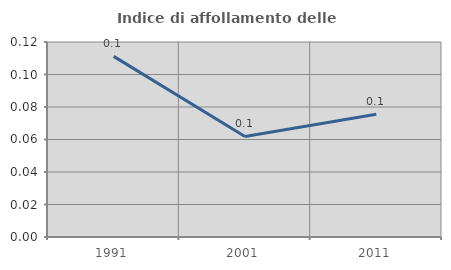
| Category | Indice di affollamento delle abitazioni  |
|---|---|
| 1991.0 | 0.111 |
| 2001.0 | 0.062 |
| 2011.0 | 0.076 |